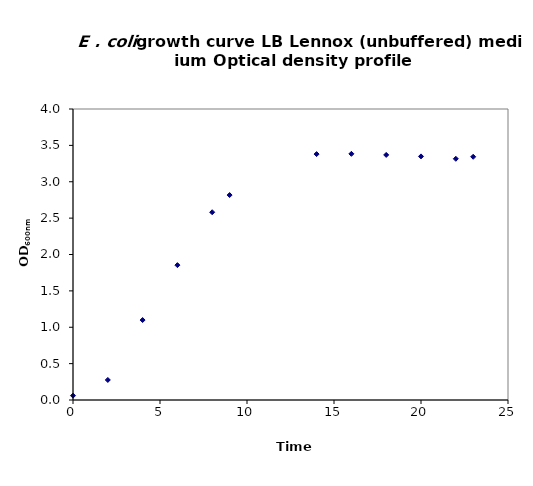
| Category | OD600nm (Actual) Average |
|---|---|
| 0.0 | 0.06 |
| 2.0 | 0.275 |
| 4.0 | 1.099 |
| 6.0 | 1.854 |
| 8.0 | 2.581 |
| 9.0 | 2.817 |
| 14.0 | 3.38 |
| 16.0 | 3.384 |
| 18.0 | 3.369 |
| 20.0 | 3.348 |
| 22.0 | 3.316 |
| 23.0 | 3.343 |